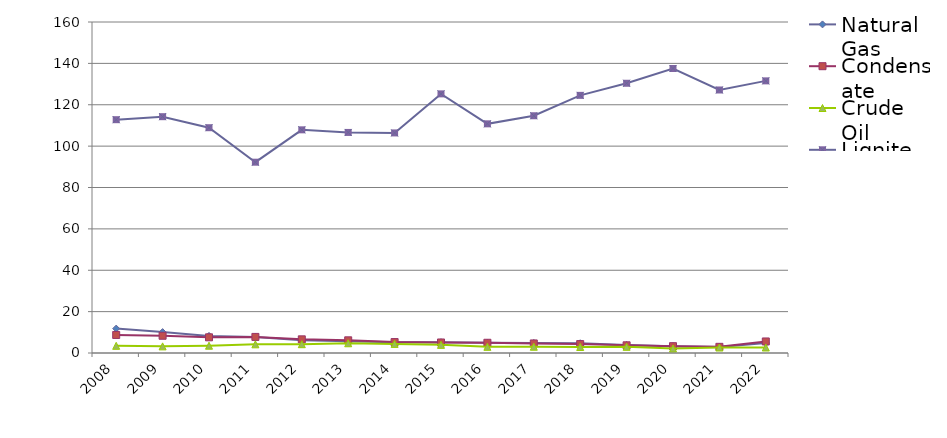
| Category | Natural Gas | Condensate | Crude Oil | Lignite  |
|---|---|---|---|---|
| 2008 | 11.804 | 8.717 | 3.472 | 112.779 |
| 2009 | 10.102 | 8.331 | 3.206 | 114.233 |
| 2010 | 8.275 | 7.58 | 3.529 | 108.904 |
| 2011 | 7.707 | 7.773 | 4.199 | 92.232 |
| 2012 | 6.18 | 6.607 | 4.255 | 107.879 |
| 2013 | 5.701 | 6.128 | 4.711 | 106.615 |
| 2014 | 5.214 | 5.285 | 4.409 | 106.38 |
| 2015 | 5.198 | 5.087 | 3.934 | 125.259 |
| 2016 | 4.954 | 4.946 | 2.988 | 110.772 |
| 2017 | 4.851 | 4.617 | 3.034 | 114.678 |
| 2018 | 4.706 | 4.309 | 2.903 | 124.539 |
| 2019 | 3.853 | 3.718 | 2.994 | 130.386 |
| 2020 | 3.308 | 3.306 | 2.158 | 137.528 |
| 2021 | 2.945 | 2.976 | 2.657 | 127.138 |
| 2022 | 4.821 | 5.581 | 2.665 | 131.546 |